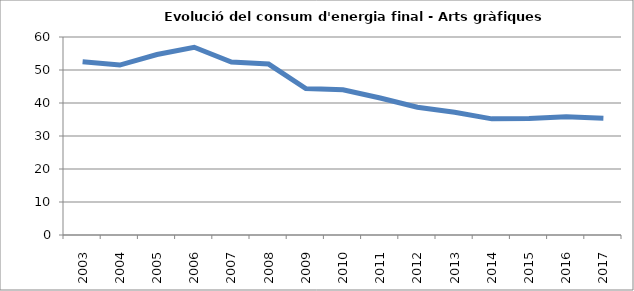
| Category | 52,5 51,5 54,7 56,9 52,4 51,8 44,4 44,0 41,5 38,7 37,2 35,2 35,3 35,8 35,4 |
|---|---|
| 2003.0 | 52.5 |
| 2004.0 | 51.5 |
| 2005.0 | 54.7 |
| 2006.0 | 56.9 |
| 2007.0 | 52.4 |
| 2008.0 | 51.8 |
| 2009.0 | 44.4 |
| 2010.0 | 44 |
| 2011.0 | 41.5 |
| 2012.0 | 38.7 |
| 2013.0 | 37.2 |
| 2014.0 | 35.2 |
| 2015.0 | 35.3 |
| 2016.0 | 35.8 |
| 2017.0 | 35.4 |